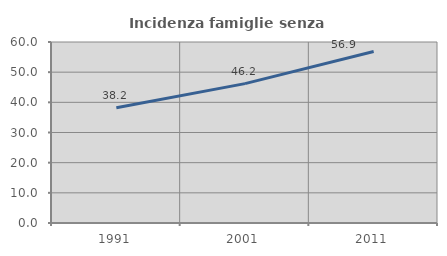
| Category | Incidenza famiglie senza nuclei |
|---|---|
| 1991.0 | 38.205 |
| 2001.0 | 46.205 |
| 2011.0 | 56.851 |